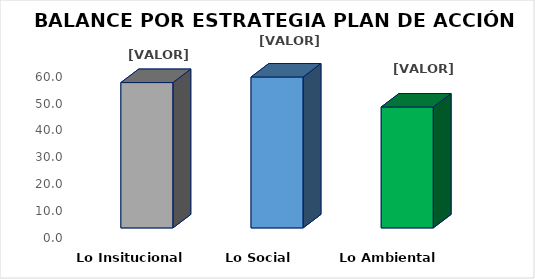
| Category | Series 0 |
|---|---|
| Lo Insitucional | 54.061 |
| Lo Social  | 56.135 |
| Lo Ambiental  | 44.972 |